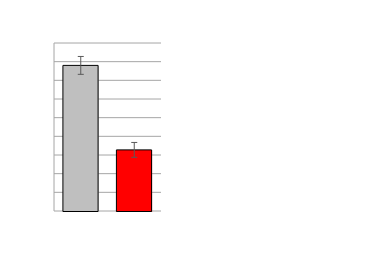
| Category | Series 0 |
|---|---|
| Control | 5560.028 |
| Cilk1 cKO | 4654.835 |